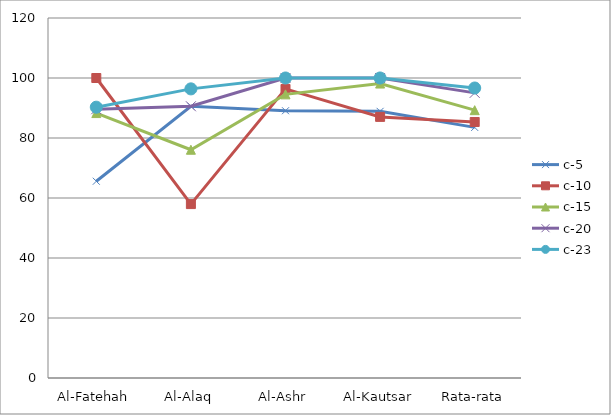
| Category | c-5 | c-10 | c-15 | c-20 | c-23 |
|---|---|---|---|---|---|
| Al-Fatehah | 65.584 | 100 | 88.312 | 89.61 | 90.26 |
| Al-Alaq | 90.58 | 57.971 | 76.087 | 90.58 | 96.377 |
| Al-Ashr | 89.091 | 96.364 | 94.545 | 100 | 100 |
| Al-Kautsar | 88.889 | 87.037 | 98.148 | 100 | 100 |
| Rata-rata | 83.536 | 85.343 | 89.273 | 95.048 | 96.659 |